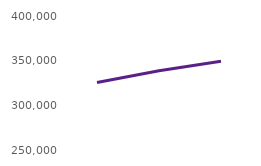
| Category | Users accessing the website |
|---|---|
| Sep23 | 325581 |
| Oct23 | 338597 |
| Nov23 | 349382 |